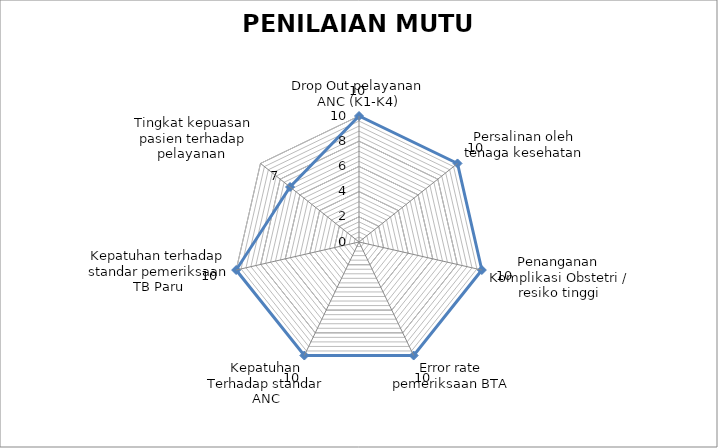
| Category | Series 0 |
|---|---|
| Drop Out pelayanan ANC (K1-K4) | 10 |
| Persalinan oleh tenaga kesehatan | 10 |
| Penanganan Komplikasi Obstetri / resiko tinggi | 10 |
| Error rate pemeriksaan BTA | 10 |
| Kepatuhan Terhadap standar ANC | 10 |
| Kepatuhan terhadap standar pemeriksaan TB Paru | 10 |
| Tingkat kepuasan pasien terhadap pelayanan  | 7 |